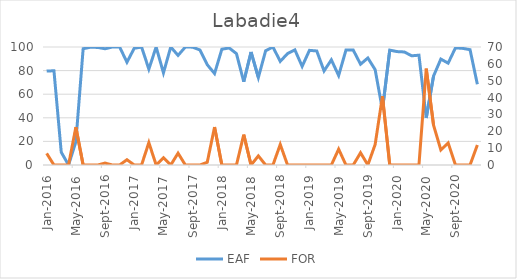
| Category | EAF |
|---|---|
| 2016-01-01 | 79.6 |
| 2016-02-01 | 79.86 |
| 2016-03-01 | 10.82 |
| 2016-04-01 | 0 |
| 2016-05-01 | 19.57 |
| 2016-06-01 | 98.53 |
| 2016-07-01 | 99.82 |
| 2016-08-01 | 99.63 |
| 2016-09-01 | 98.5 |
| 2016-10-01 | 100 |
| 2016-11-01 | 100 |
| 2016-12-01 | 87.12 |
| 2017-01-01 | 98.95 |
| 2017-02-01 | 99.93 |
| 2017-03-01 | 81.3 |
| 2017-04-01 | 100 |
| 2017-05-01 | 78.07 |
| 2017-06-01 | 100 |
| 2017-07-01 | 92.9 |
| 2017-08-01 | 100 |
| 2017-09-01 | 99.87 |
| 2017-10-01 | 97.45 |
| 2017-11-01 | 84.98 |
| 2017-12-01 | 77.51 |
| 2018-01-01 | 98.12 |
| 2018-02-01 | 99.19 |
| 2018-03-01 | 94.38 |
| 2018-04-01 | 70.56 |
| 2018-05-01 | 95.76 |
| 2018-06-01 | 74.14 |
| 2018-07-01 | 96.85 |
| 2018-08-01 | 100 |
| 2018-09-01 | 87.82 |
| 2018-10-01 | 94.43 |
| 2018-11-01 | 97.6 |
| 2018-12-01 | 83.58 |
| 2019-01-01 | 97.16 |
| 2019-02-01 | 96.64 |
| 2019-03-01 | 79.71 |
| 2019-04-01 | 89.11 |
| 2019-05-01 | 75.8 |
| 2019-06-01 | 97.37 |
| 2019-07-01 | 97.37 |
| 2019-08-01 | 85.41 |
| 2019-09-01 | 90.69 |
| 2019-10-01 | 80.79 |
| 2019-11-01 | 46.82 |
| 2019-12-01 | 97.36 |
| 2020-01-01 | 96.11 |
| 2020-02-01 | 95.79 |
| 2020-03-01 | 92.54 |
| 2020-04-01 | 93.06 |
| 2020-05-01 | 39.85 |
| 2020-06-01 | 75.4 |
| 2020-07-01 | 89.76 |
| 2020-08-01 | 86.31 |
| 2020-09-01 | 99.27 |
| 2020-10-01 | 98.83 |
| 2020-11-01 | 97.72 |
| 2020-12-01 | 68.44 |